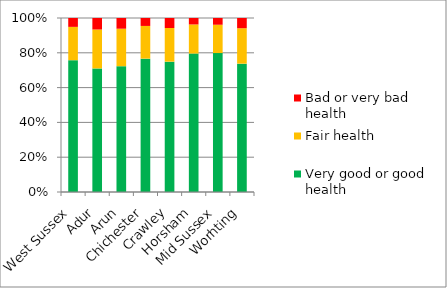
| Category | Very good or good health | Fair health | Bad or very bad health |
|---|---|---|---|
| West Sussex | 63698 | 16094 | 4286 |
| Adur | 4925 | 1552 | 458 |
| Arun | 11914 | 3550 | 1013 |
| Chichester | 9528 | 2336 | 567 |
| Crawley | 7399 | 1909 | 569 |
| Horsham | 10802 | 2269 | 503 |
| Mid Sussex | 11121 | 2266 | 539 |
| Worhting | 8009 | 2212 | 637 |